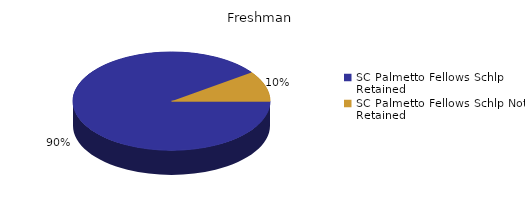
| Category | Freshman |
|---|---|
| SC Palmetto Fellows Schlp Retained  | 399 |
| SC Palmetto Fellows Schlp Not Retained  | 44 |